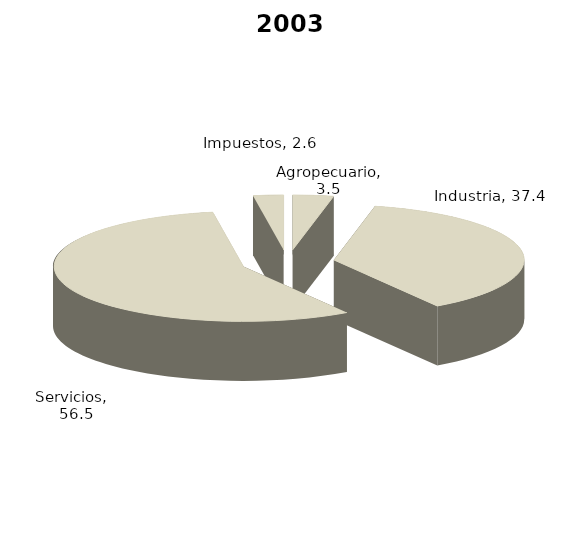
| Category | 2003 |
|---|---|
| Agropecuario | 3.459 |
| Industria | 37.399 |
| Servicios | 56.572 |
| Impuestos | 2.571 |